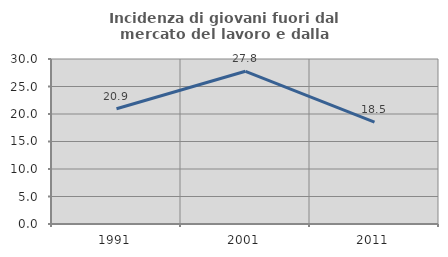
| Category | Incidenza di giovani fuori dal mercato del lavoro e dalla formazione  |
|---|---|
| 1991.0 | 20.945 |
| 2001.0 | 27.767 |
| 2011.0 | 18.53 |